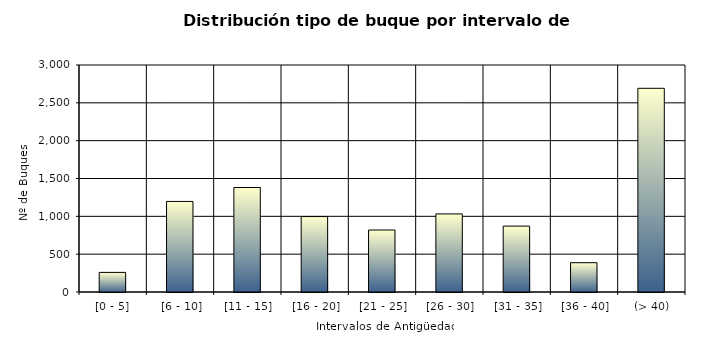
| Category | Series 0 |
|---|---|
| [0 - 5] | 259 |
|  [6 - 10] | 1197 |
|  [11 - 15] | 1381 |
|  [16 - 20] | 997 |
|  [21 - 25] | 819 |
|  [26 - 30] | 1032 |
|  [31 - 35] | 871 |
|  [36 - 40] | 387 |
|  (> 40) | 2692 |